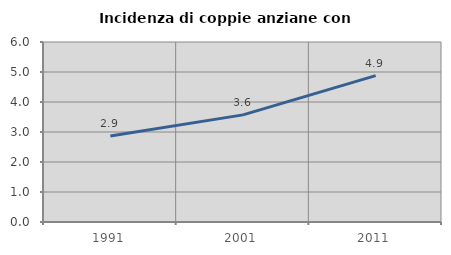
| Category | Incidenza di coppie anziane con figli |
|---|---|
| 1991.0 | 2.864 |
| 2001.0 | 3.571 |
| 2011.0 | 4.878 |